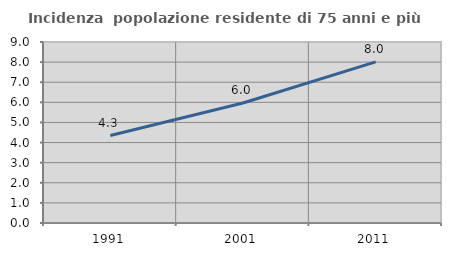
| Category | Incidenza  popolazione residente di 75 anni e più |
|---|---|
| 1991.0 | 4.347 |
| 2001.0 | 5.966 |
| 2011.0 | 8.014 |